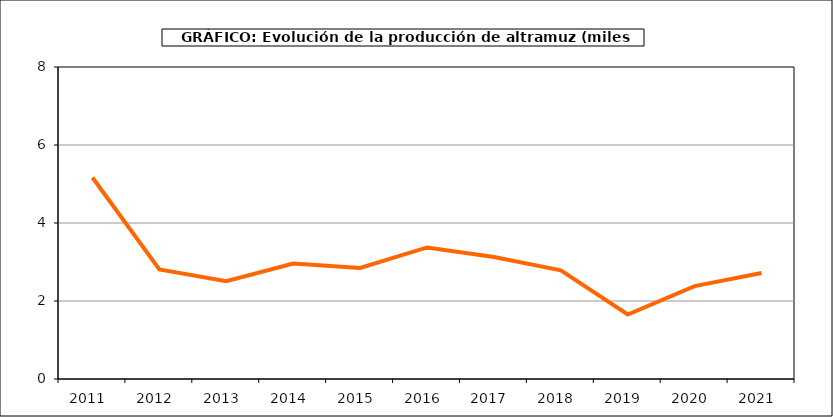
| Category | Producción |
|---|---|
| 2011.0 | 5.166 |
| 2012.0 | 2.807 |
| 2013.0 | 2.508 |
| 2014.0 | 2.963 |
| 2015.0 | 2.847 |
| 2016.0 | 3.373 |
| 2017.0 | 3.127 |
| 2018.0 | 2.786 |
| 2019.0 | 1.653 |
| 2020.0 | 2.383 |
| 2021.0 | 2.718 |